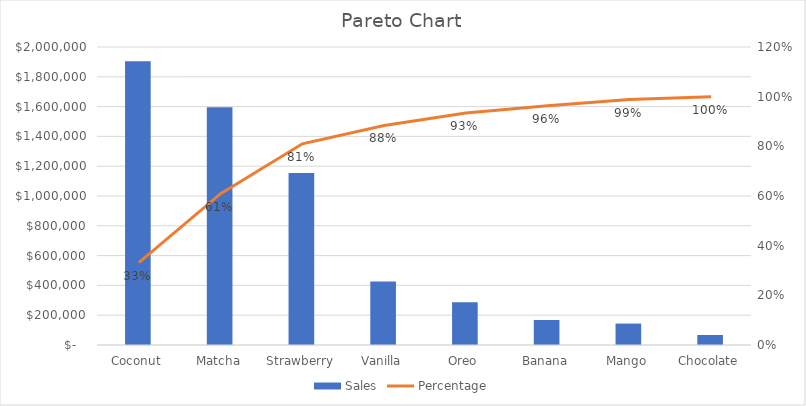
| Category | Sales |
|---|---|
| Coconut | 1904758.08 |
| Matcha | 1596218.04 |
| Strawberry | 1154206.53 |
| Vanilla | 425988.3 |
| Oreo | 286789.43 |
| Banana | 167946.62 |
| Mango | 143931.94 |
| Chocolate | 67001.29 |